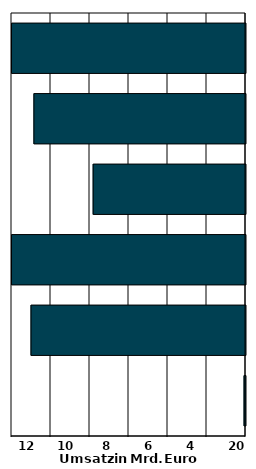
| Category | Series 0 |
|---|---|
| 0 | -0.074 |
| 1 | -11 |
| 2 | -14.863 |
| 3 | -7.813 |
| 4 | -10.85 |
| 5 | -38.444 |